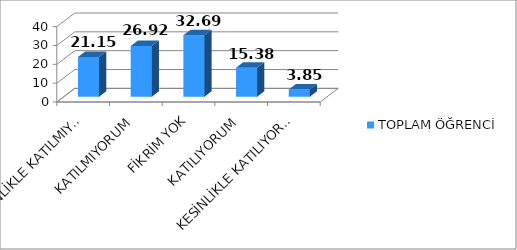
| Category | TOPLAM ÖĞRENCİ |
|---|---|
| KESİNLİKLE KATILMIYORUM | 21.15 |
| KATILMIYORUM | 26.92 |
| FİKRİM YOK | 32.69 |
| KATILIYORUM | 15.38 |
| KESİNLİKLE KATILIYORUM | 3.85 |